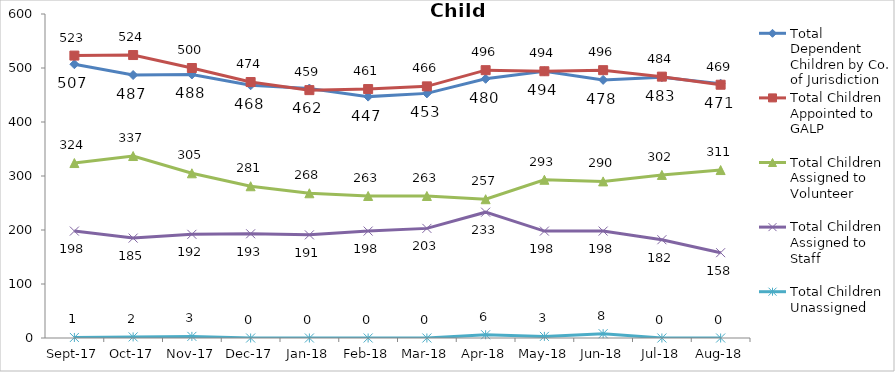
| Category | Total Dependent Children by Co. of Jurisdiction | Total Children Appointed to GALP | Total Children Assigned to Volunteer | Total Children Assigned to Staff | Total Children Unassigned |
|---|---|---|---|---|---|
| 2017-09-01 | 507 | 523 | 324 | 198 | 1 |
| 2017-10-01 | 487 | 524 | 337 | 185 | 2 |
| 2017-11-01 | 488 | 500 | 305 | 192 | 3 |
| 2017-12-01 | 468 | 474 | 281 | 193 | 0 |
| 2018-01-01 | 462 | 459 | 268 | 191 | 0 |
| 2018-02-01 | 447 | 461 | 263 | 198 | 0 |
| 2018-03-01 | 453 | 466 | 263 | 203 | 0 |
| 2018-04-01 | 480 | 496 | 257 | 233 | 6 |
| 2018-05-01 | 494 | 494 | 293 | 198 | 3 |
| 2018-06-01 | 478 | 496 | 290 | 198 | 8 |
| 2018-07-01 | 483 | 484 | 302 | 182 | 0 |
| 2018-08-01 | 471 | 469 | 311 | 158 | 0 |